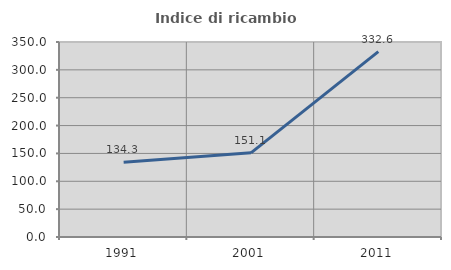
| Category | Indice di ricambio occupazionale  |
|---|---|
| 1991.0 | 134.254 |
| 2001.0 | 151.053 |
| 2011.0 | 332.624 |